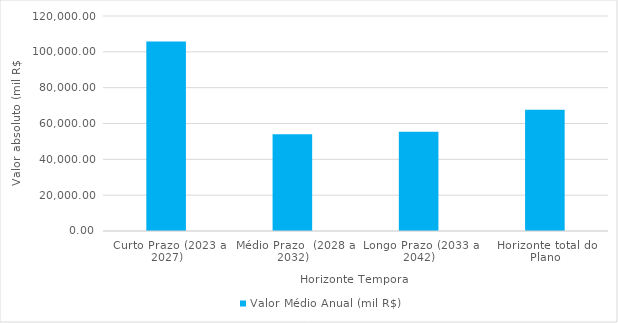
| Category | Valor Médio Anual (mil R$) |
|---|---|
| Curto Prazo (2023 a 2027) | 105754.582 |
| Médio Prazo  (2028 a 2032) | 54029.242 |
| Longo Prazo (2033 a 2042) | 55384.542 |
| Horizonte total do Plano | 67638.227 |